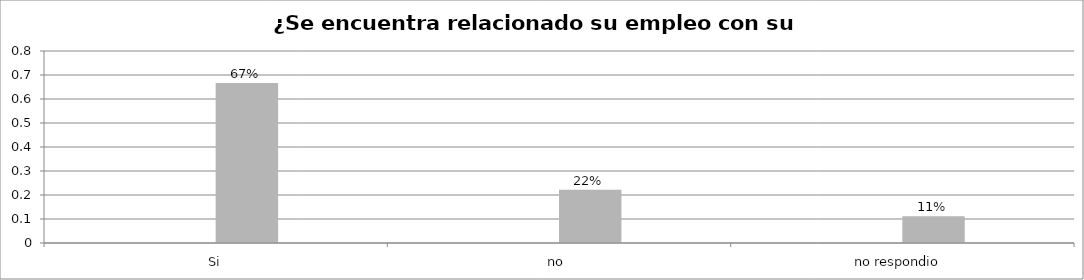
| Category | Series 0 | Series 1 | Series 2 | Series 3 |
|---|---|---|---|---|
| Si |  |  | 0.667 |  |
| no  |  |  | 0.222 |  |
| no respondio  |  |  | 0.111 |  |